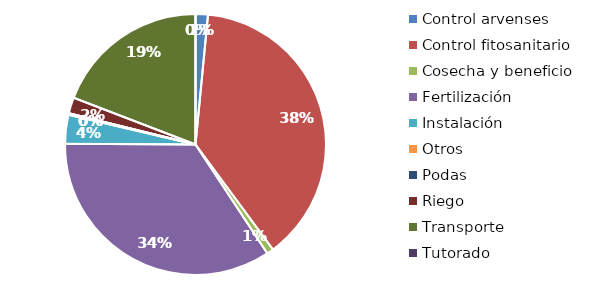
| Category | Valor |
|---|---|
| Control arvenses | 2011080 |
| Control fitosanitario | 50406619 |
| Cosecha y beneficio | 1096558.471 |
| Fertilización | 45189096 |
| Instalación | 4656022.081 |
| Otros | 261085 |
| Podas | 0 |
| Riego | 2610854 |
| Transporte | 25191322.2 |
| Tutorado | 0 |